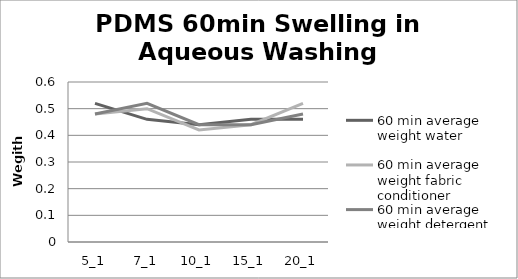
| Category | 60 min average weight water | 60 min average weight fabric conditioner | 60 min average weight detergent |
|---|---|---|---|
| 5_1 | 0.52 | 0.48 | 0.48 |
| 7_1 | 0.46 | 0.5 | 0.52 |
| 10_1 | 0.44 | 0.42 | 0.44 |
| 15_1 | 0.46 | 0.44 | 0.44 |
| 20_1 | 0.46 | 0.52 | 0.48 |